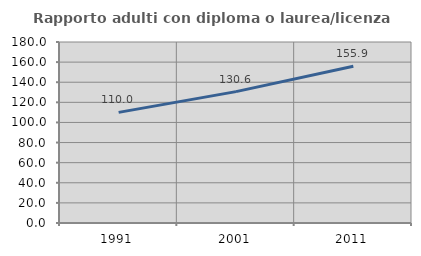
| Category | Rapporto adulti con diploma o laurea/licenza media  |
|---|---|
| 1991.0 | 110 |
| 2001.0 | 130.645 |
| 2011.0 | 155.932 |